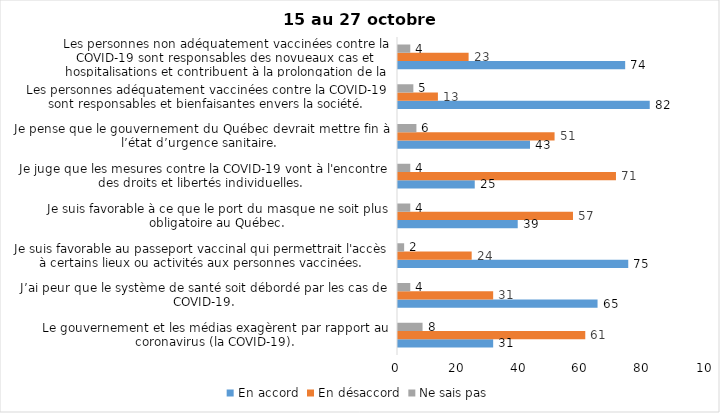
| Category | En accord | En désaccord | Ne sais pas |
|---|---|---|---|
| Le gouvernement et les médias exagèrent par rapport au coronavirus (la COVID-19). | 31 | 61 | 8 |
| J’ai peur que le système de santé soit débordé par les cas de COVID-19. | 65 | 31 | 4 |
| Je suis favorable au passeport vaccinal qui permettrait l'accès à certains lieux ou activités aux personnes vaccinées. | 75 | 24 | 2 |
| Je suis favorable à ce que le port du masque ne soit plus obligatoire au Québec. | 39 | 57 | 4 |
| Je juge que les mesures contre la COVID-19 vont à l'encontre des droits et libertés individuelles.  | 25 | 71 | 4 |
| Je pense que le gouvernement du Québec devrait mettre fin à l’état d’urgence sanitaire.  | 43 | 51 | 6 |
| Les personnes adéquatement vaccinées contre la COVID-19 sont responsables et bienfaisantes envers la société. | 82 | 13 | 5 |
| Les personnes non adéquatement vaccinées contre la COVID-19 sont responsables des novueaux cas et hospitalisations et contribuent à la prolongation de la pandémie au Québec. | 74 | 23 | 4 |